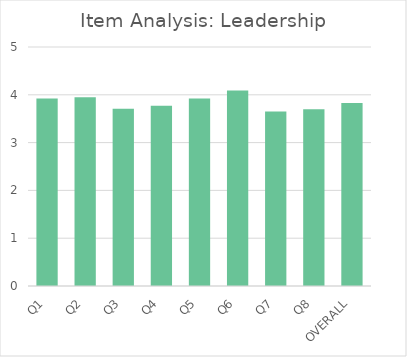
| Category | Series 0 |
|---|---|
| Q1 | 3.92 |
| Q2 | 3.95 |
| Q3 | 3.71 |
| Q4 | 3.77 |
| Q5 | 3.92 |
| Q6 | 4.09 |
| Q7 | 3.65 |
| Q8 | 3.7 |
| OVERALL | 3.83 |